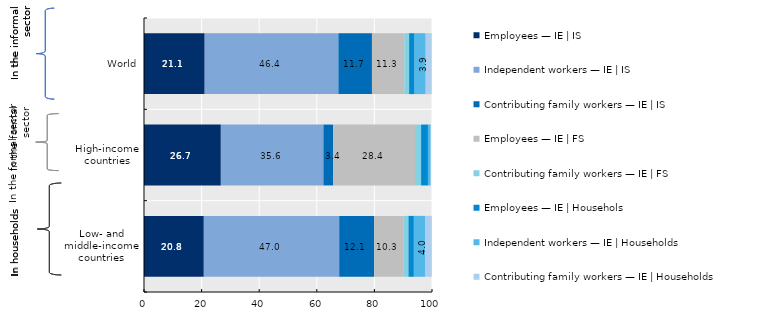
| Category | Employees — IE | IS | Independent workers — IE | IS | Contributing family workers — IE | IS | Employees — IE | FS | Contributing family workers — IE | FS | Employees — IE | Househols | Independent workers — IE | Households | Contributing family workers — IE | Households |
|---|---|---|---|---|---|---|---|---|
| Low- and middle-income countries | 20.769 | 47.014 | 12.105 | 10.316 | 1.627 | 1.873 | 4.012 | 2.204 |
| High-income countries | 26.683 | 35.608 | 3.402 | 28.405 | 2.113 | 2.386 | 0.932 | 0.073 |
| World | 21.076 | 46.423 | 11.654 | 11.254 | 1.652 | 1.9 | 3.852 | 2.093 |